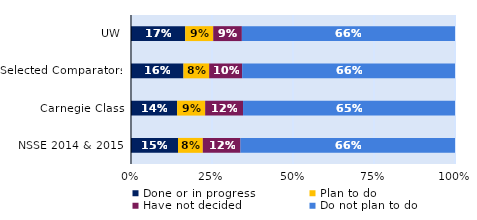
| Category | Done or in progress | Plan to do | Have not decided | Do not plan to do |
|---|---|---|---|---|
| UW | 0.167 | 0.086 | 0.088 | 0.658 |
| Selected Comparators | 0.162 | 0.079 | 0.102 | 0.657 |
| Carnegie Class | 0.142 | 0.087 | 0.117 | 0.654 |
| NSSE 2014 & 2015 | 0.145 | 0.077 | 0.116 | 0.662 |